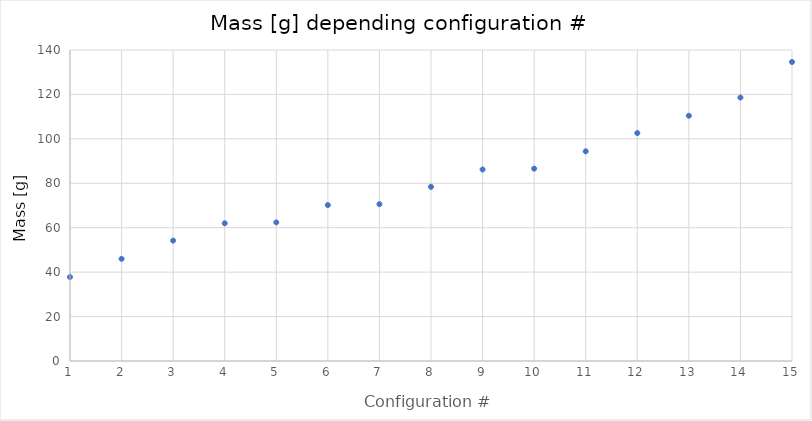
| Category | mass [g] |
|---|---|
| 1.0 | 37.8 |
| 2.0 | 46 |
| 3.0 | 54.2 |
| 4.0 | 62 |
| 5.0 | 62.4 |
| 6.0 | 70.2 |
| 7.0 | 70.6 |
| 8.0 | 78.4 |
| 9.0 | 86.2 |
| 10.0 | 86.6 |
| 11.0 | 94.4 |
| 12.0 | 102.6 |
| 13.0 | 110.4 |
| 14.0 | 118.6 |
| 15.0 | 134.6 |